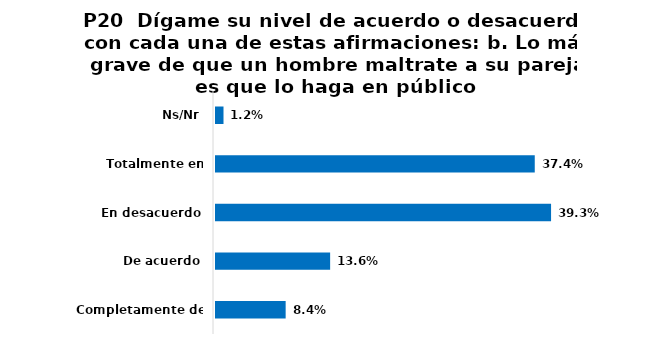
| Category | Series 0 |
|---|---|
| Completamente de acuerdo | 0.084 |
| De acuerdo | 0.136 |
| En desacuerdo | 0.393 |
| Totalmente en desacuerdo | 0.374 |
| Ns/Nr | 0.012 |